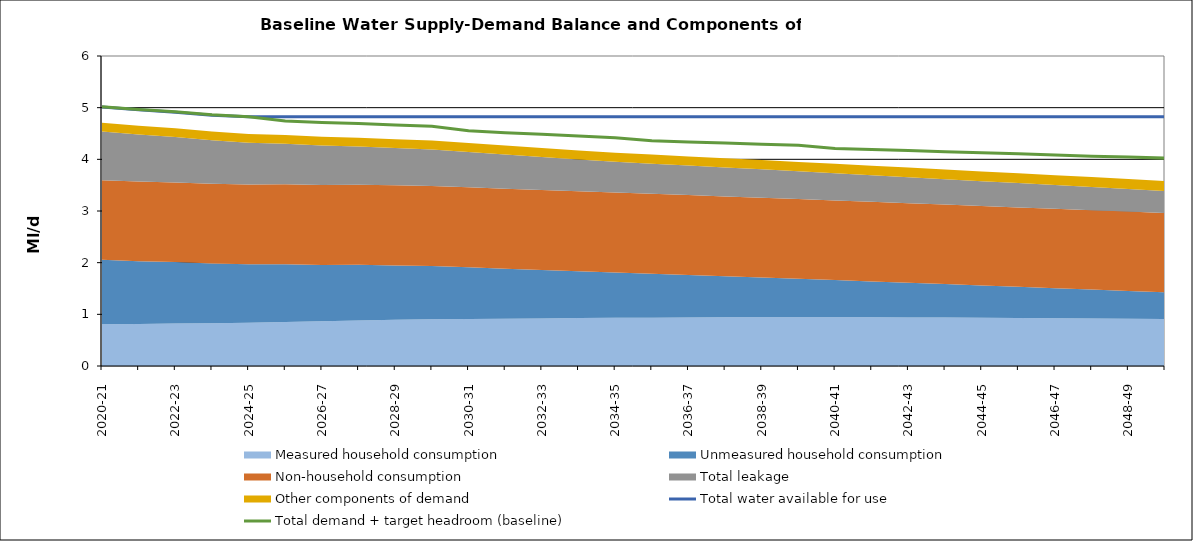
| Category | Total water available for use | Total demand + target headroom (baseline) |
|---|---|---|
| 0 | 5.011 | 5.017 |
| 1 | 4.961 | 4.967 |
| 2 | 4.911 | 4.923 |
| 3 | 4.854 | 4.865 |
| 4 | 4.823 | 4.824 |
| 5 | 4.823 | 4.741 |
| 6 | 4.823 | 4.712 |
| 7 | 4.823 | 4.694 |
| 8 | 4.823 | 4.667 |
| 9 | 4.823 | 4.642 |
| 10 | 4.823 | 4.552 |
| 11 | 4.823 | 4.516 |
| 12 | 4.823 | 4.484 |
| 13 | 4.823 | 4.449 |
| 14 | 4.823 | 4.417 |
| 15 | 4.823 | 4.358 |
| 16 | 4.823 | 4.337 |
| 17 | 4.823 | 4.315 |
| 18 | 4.823 | 4.293 |
| 19 | 4.823 | 4.27 |
| 20 | 4.823 | 4.211 |
| 21 | 4.823 | 4.19 |
| 22 | 4.823 | 4.172 |
| 23 | 4.823 | 4.148 |
| 24 | 4.823 | 4.128 |
| 25 | 4.823 | 4.106 |
| 26 | 4.823 | 4.086 |
| 27 | 4.823 | 4.062 |
| 28 | 4.823 | 4.043 |
| 29 | 4.823 | 4.023 |